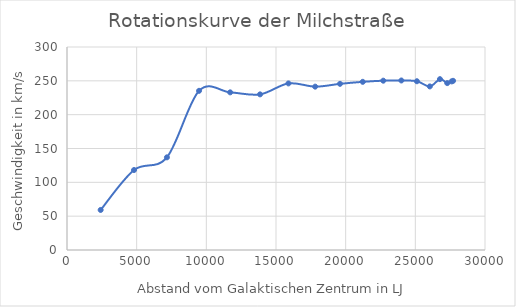
| Category | Series 0 |
|---|---|
| 2415.085590445319 | 59.174 |
| 4811.790921905468 | 118.203 |
| 7171.87562025969 | 136.94 |
| 9477.378016507799 | 235.244 |
| 11710.751845912177 | 232.976 |
| 13854.999785662585 | 230 |
| 15893.802814761606 | 246.187 |
| 17811.644411623907 | 241.413 |
| 19593.928644170584 | 245.563 |
| 21227.09125368178 | 248.53 |
| 22698.702886992356 | 250.213 |
| 23997.563691371266 | 250.526 |
| 25113.78855216062 | 249.388 |
| 26038.88232446445 | 241.732 |
| 26765.80448632868 | 252.504 |
| 27289.02272136255 | 246.658 |
| 27604.555023005396 | 249.163 |
| 27709.99999999999 | 250 |